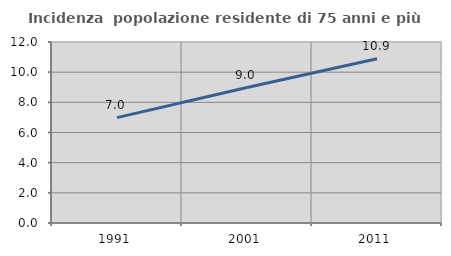
| Category | Incidenza  popolazione residente di 75 anni e più |
|---|---|
| 1991.0 | 6.987 |
| 2001.0 | 8.981 |
| 2011.0 | 10.889 |